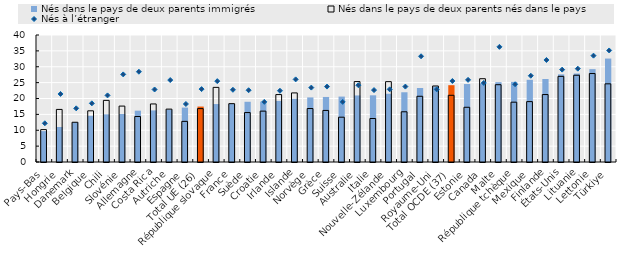
| Category | Nés dans le pays de deux parents immigrés | Nés dans le pays de deux parents nés dans le pays |
|---|---|---|
| Pays-Bas | 9.727 | 10.202 |
| Hongrie | 11.03 | 16.564 |
| Danemark | 12.509 | 12.516 |
| Belgique | 14.549 | 16.12 |
| Chili | 15.009 | 19.411 |
| Slovénie | 15.124 | 17.612 |
| Allemagne | 16.168 | 14.329 |
| Costa Rica | 16.25 | 18.286 |
| Autriche | 16.481 | 16.655 |
| Espagne | 17.137 | 12.796 |
| Total UE (26) | 17.463 | 16.814 |
| République slovaque | 18.251 | 23.506 |
| France | 18.283 | 18.378 |
| Suède | 18.973 | 15.569 |
| Croatie | 19.003 | 16.021 |
| Irlande | 19.239 | 21.239 |
| Islande | 19.915 | 21.759 |
| Norvège | 20.344 | 16.84 |
| Grèce | 20.484 | 16.243 |
| Suisse | 20.604 | 14.114 |
| Australie | 20.96 | 25.328 |
| Italie | 21.007 | 13.701 |
| Nouvelle-Zélande | 21.492 | 25.3 |
| Luxembourg | 21.964 | 15.815 |
| Portugal | 23.303 | 20.703 |
| Royaume-Uni | 23.789 | 23.943 |
| Total OCDE (37) | 24.193 | 21.013 |
| Estonie | 24.558 | 17.236 |
| Canada | 24.75 | 26.233 |
| Malte | 25.141 | 24.35 |
| République tchèque | 25.232 | 18.84 |
| Mexique | 25.891 | 19.018 |
| Finlande | 26.142 | 21.243 |
| États-Unis | 27.604 | 26.975 |
| Lituanie | 27.865 | 27.327 |
| Lettonie | 29.248 | 27.863 |
| Türkiye | 32.581 | 24.621 |